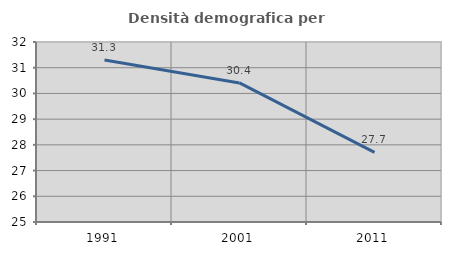
| Category | Densità demografica |
|---|---|
| 1991.0 | 31.3 |
| 2001.0 | 30.409 |
| 2011.0 | 27.707 |